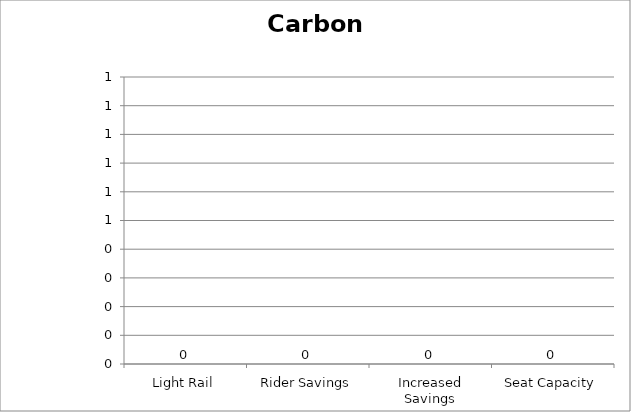
| Category | Carbon Monoxide |
|---|---|
| Light Rail | 0 |
| Rider Savings | 0 |
| Increased Savings | 0 |
| Seat Capacity | 0 |